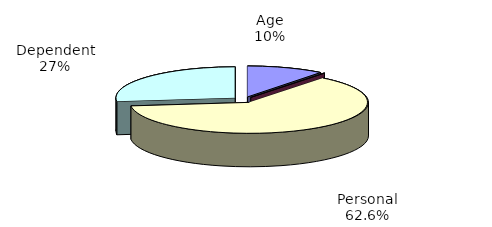
| Category | Series 0 |
|---|---|
| Age | 901741 |
| Blindness | 8658 |
| Personal | 5366527 |
| Dependent | 2300688 |